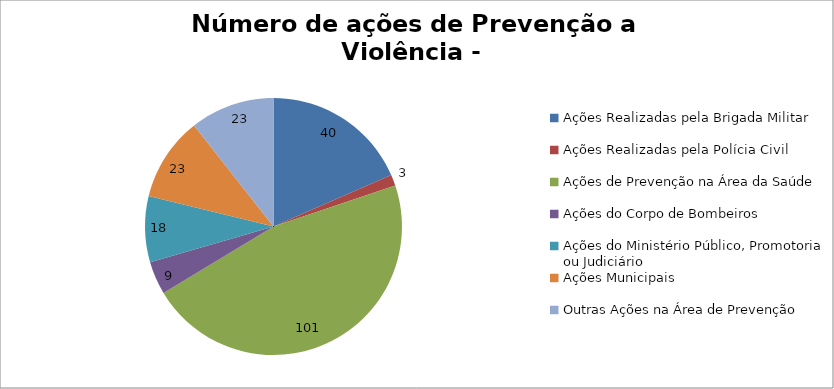
| Category | Número de Ações |
|---|---|
| Ações Realizadas pela Brigada Militar | 40 |
| Ações Realizadas pela Polícia Civil | 3 |
| Ações de Prevenção na Área da Saúde | 101 |
| Ações do Corpo de Bombeiros | 9 |
| Ações do Ministério Público, Promotoria ou Judiciário | 18 |
| Ações Municipais | 23 |
| Outras Ações na Área de Prevenção | 23 |